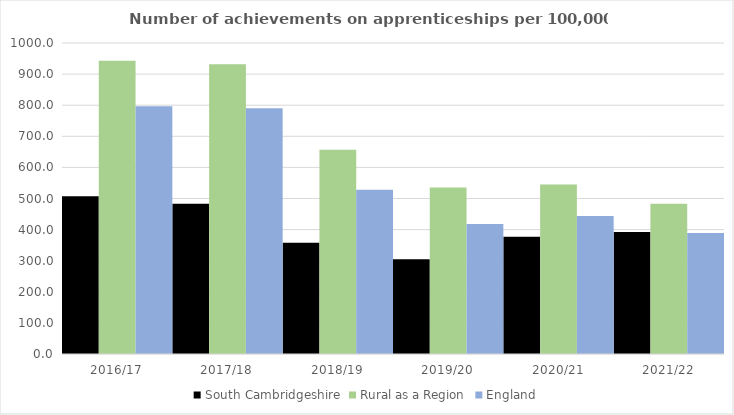
| Category | South Cambridgeshire | Rural as a Region | England |
|---|---|---|---|
| 2016/17 | 507 | 942.594 | 797 |
| 2017/18 | 483 | 931.709 | 790 |
| 2018/19 | 358 | 656.44 | 528 |
| 2019/20 | 305 | 535.552 | 418 |
| 2020/21 | 377 | 545.333 | 444 |
| 2021/22 | 392 | 482.936 | 389 |